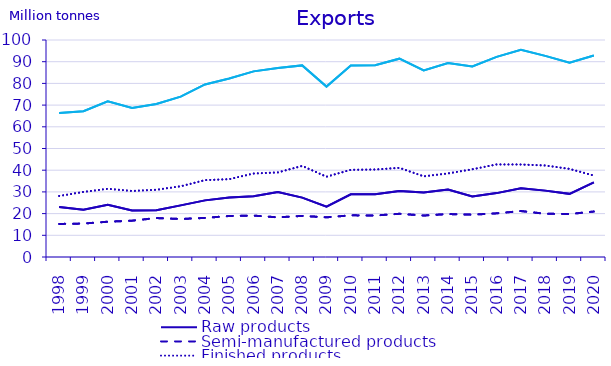
| Category | Raw products | Semi-manufactured products | Finished products | Total |
|---|---|---|---|---|
| 1998.0 | 23.014 | 15.225 | 28.118 | 66.356 |
| 1999.0 | 21.768 | 15.418 | 29.983 | 67.169 |
| 2000.0 | 24.092 | 16.259 | 31.435 | 71.786 |
| 2001.0 | 21.458 | 16.744 | 30.44 | 68.642 |
| 2002.0 | 21.553 | 17.952 | 30.983 | 70.488 |
| 2003.0 | 23.794 | 17.523 | 32.59 | 73.906 |
| 2004.0 | 26.099 | 18.01 | 35.421 | 79.53 |
| 2005.0 | 27.44 | 18.905 | 35.877 | 82.222 |
| 2006.0 | 28.008 | 19.074 | 38.469 | 85.551 |
| 2007.0 | 29.901 | 18.267 | 38.976 | 87.144 |
| 2008.0 | 27.364 | 18.951 | 41.977 | 88.292 |
| 2009.0 | 23.233 | 18.287 | 36.999 | 78.518 |
| 2010.0 | 28.899 | 19.203 | 40.179 | 88.281 |
| 2011.0 | 28.913 | 19.112 | 40.328 | 88.353 |
| 2012.0 | 30.4 | 19.907 | 41.083 | 91.39 |
| 2013.0 | 29.709 | 19.106 | 37.177 | 85.992 |
| 2014.0 | 31.1 | 19.806 | 38.513 | 89.419 |
| 2015.0 | 27.91 | 19.502 | 40.427 | 87.84 |
| 2016.0 | 29.44 | 20.124 | 42.654 | 92.218 |
| 2017.0 | 31.692 | 21.176 | 42.627 | 95.496 |
| 2018.0 | 30.59 | 19.922 | 42.174 | 92.686 |
| 2019.0 | 29.098 | 19.797 | 40.599 | 89.494 |
| 2020.0 | 34.37 | 20.951 | 37.553 | 92.874 |